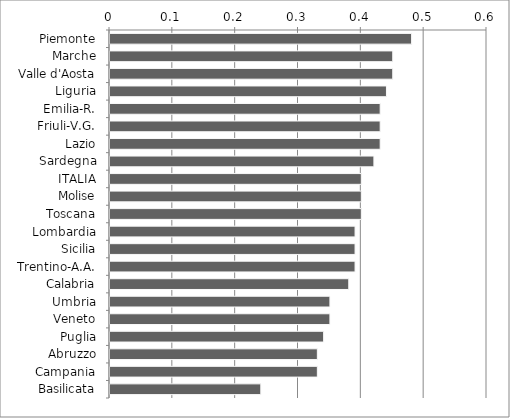
| Category | Series 0 |
|---|---|
| Piemonte | 0.48 |
| Marche | 0.45 |
| Valle d'Aosta | 0.45 |
| Liguria | 0.44 |
| Emilia-R. | 0.43 |
| Friuli-V.G. | 0.43 |
| Lazio | 0.43 |
| Sardegna | 0.42 |
| ITALIA | 0.4 |
| Molise | 0.4 |
| Toscana | 0.4 |
| Lombardia | 0.39 |
| Sicilia | 0.39 |
| Trentino-A.A. | 0.39 |
| Calabria | 0.38 |
| Umbria | 0.35 |
| Veneto | 0.35 |
| Puglia | 0.34 |
| Abruzzo | 0.33 |
| Campania | 0.33 |
| Basilicata | 0.24 |